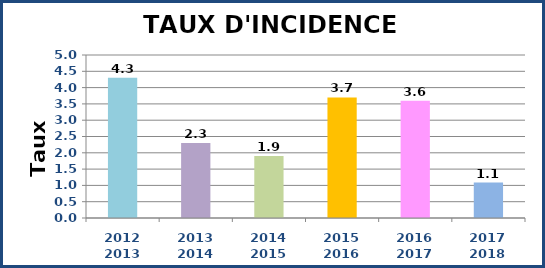
| Category | Series 0 |
|---|---|
| 2012
2013 | 4.3 |
| 2013
2014 | 2.3 |
| 2014
2015 | 1.9 |
| 2015
2016 | 3.7 |
| 2016
2017 | 3.6 |
| 2017
2018 | 1.088 |